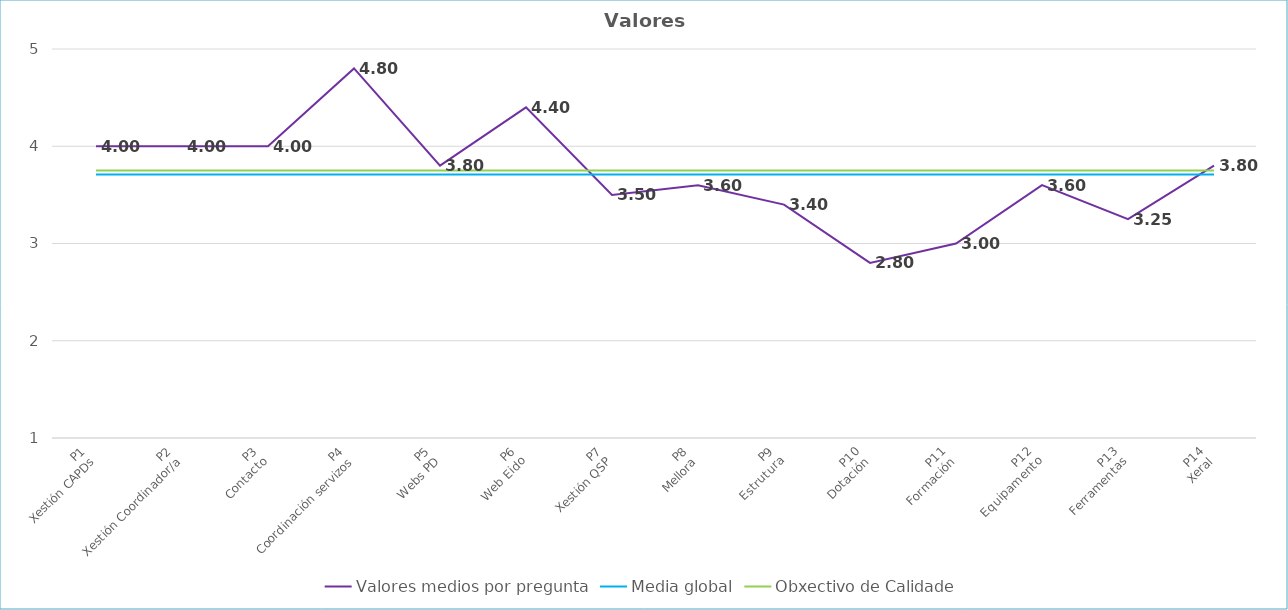
| Category | Valores medios por pregunta | Media global | Obxectivo de Calidade |
|---|---|---|---|
| P1
Xestión CAPDs | 4 | 3.711 | 3.75 |
| P2
Xestión Coordinador/a | 4 | 3.711 | 3.75 |
| P3
Contacto | 4 | 3.711 | 3.75 |
| P4
Coordinación servizos | 4.8 | 3.711 | 3.75 |
| P5
Webs PD | 3.8 | 3.711 | 3.75 |
| P6
Web Eido | 4.4 | 3.711 | 3.75 |
| P7
Xestión QSP | 3.5 | 3.711 | 3.75 |
| P8
Mellora | 3.6 | 3.711 | 3.75 |
| P9
Estrutura | 3.4 | 3.711 | 3.75 |
| P10
Dotación | 2.8 | 3.711 | 3.75 |
| P11
Formación | 3 | 3.711 | 3.75 |
| P12
Equipamento | 3.6 | 3.711 | 3.75 |
| P13
Ferramentas | 3.25 | 3.711 | 3.75 |
| P14
Xeral | 3.8 | 3.711 | 3.75 |